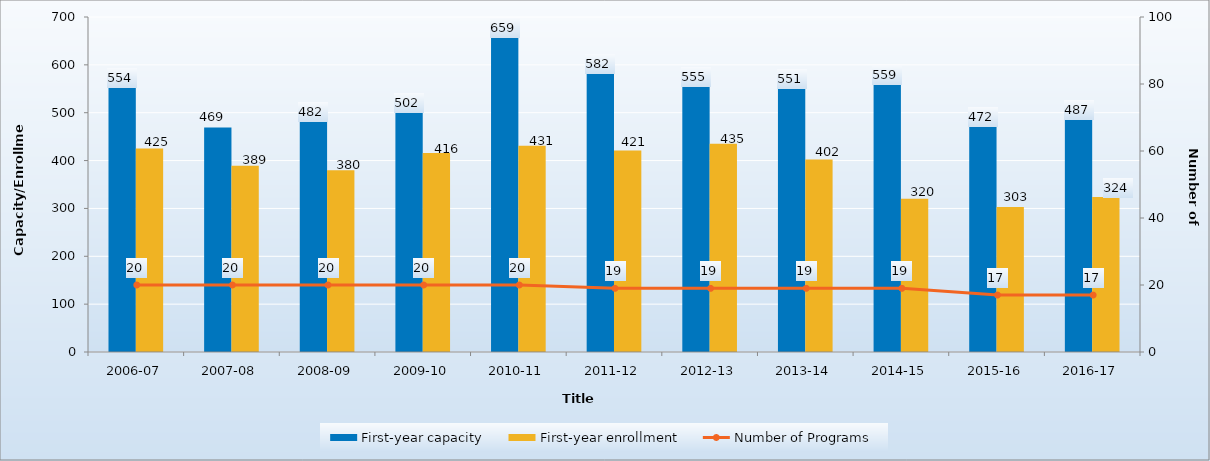
| Category | First-year capacity | First-year enrollment |
|---|---|---|
| 2006-07 | 554 | 425 |
| 2007-08 | 469 | 389 |
| 2008-09 | 482 | 380 |
| 2009-10 | 502 | 416 |
| 2010-11 | 659 | 431 |
| 2011-12 | 582 | 421 |
| 2012-13 | 555 | 435 |
| 2013-14 | 551 | 402 |
| 2014-15 | 559 | 320 |
| 2015-16 | 472 | 303 |
| 2016-17 | 487 | 324 |